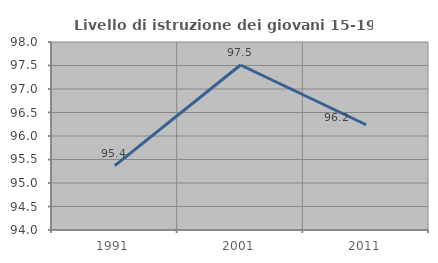
| Category | Livello di istruzione dei giovani 15-19 anni |
|---|---|
| 1991.0 | 95.37 |
| 2001.0 | 97.51 |
| 2011.0 | 96.239 |